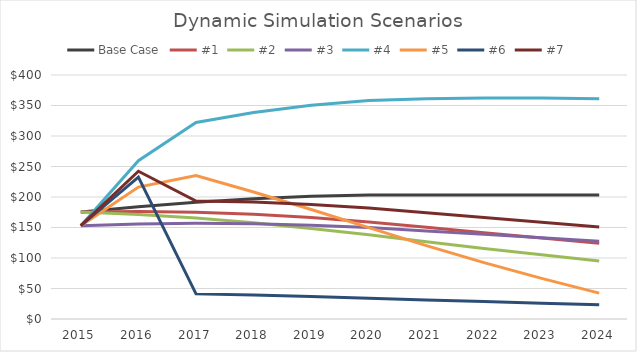
| Category | Base Case | #1 | #2 | #3 | #4 | #5 | #6 | #7 |
|---|---|---|---|---|---|---|---|---|
| 2015.0 | 175.364 | 175.364 | 175.364 | 153 | 153 | 153 | 153 | 153 |
| 2016.0 | 184.133 | 176.157 | 171.326 | 155.71 | 259.517 | 216.264 | 232.518 | 242.216 |
| 2017.0 | 191.498 | 174.908 | 165.389 | 156.793 | 322.298 | 235.19 | 41.178 | 193.432 |
| 2018.0 | 197.243 | 171.611 | 157.709 | 156.185 | 338.4 | 208.246 | 39.21 | 191.618 |
| 2019.0 | 201.188 | 166.329 | 148.5 | 153.871 | 350.485 | 179.517 | 36.863 | 187.714 |
| 2020.0 | 203.2 | 159.19 | 138.022 | 149.894 | 358.079 | 149.894 | 34.203 | 181.807 |
| 2021.0 | 203.2 | 150.388 | 126.571 | 144.345 | 360.863 | 120.288 | 31.306 | 174.047 |
| 2022.0 | 203.2 | 141.586 | 115.62 | 138.756 | 362.308 | 92.504 | 28.537 | 166.308 |
| 2023.0 | 203.2 | 132.784 | 105.155 | 133.117 | 362.374 | 66.558 | 25.891 | 158.581 |
| 2024.0 | 203.2 | 123.982 | 95.166 | 127.416 | 361.011 | 42.472 | 23.367 | 150.859 |